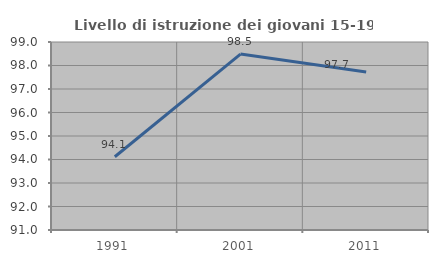
| Category | Livello di istruzione dei giovani 15-19 anni |
|---|---|
| 1991.0 | 94.118 |
| 2001.0 | 98.485 |
| 2011.0 | 97.727 |